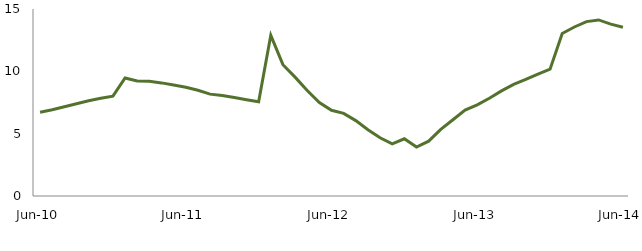
| Category | Series 0 |
|---|---|
| Jun-10 | 6.716 |
|  | 6.916 |
|  | 7.153 |
|  | 7.4 |
|  | 7.635 |
|  | 7.833 |
|  | 8.011 |
|  | 9.465 |
|  | 9.221 |
|  | 9.199 |
|  | 9.073 |
|  | 8.902 |
| Jun-11 | 8.725 |
|  | 8.478 |
|  | 8.171 |
|  | 8.061 |
|  | 7.897 |
|  | 7.718 |
|  | 7.555 |
|  | 12.888 |
|  | 10.533 |
|  | 9.535 |
|  | 8.464 |
|  | 7.503 |
| Jun-12 | 6.876 |
|  | 6.627 |
|  | 6.048 |
|  | 5.317 |
|  | 4.667 |
|  | 4.185 |
|  | 4.593 |
|  | 3.923 |
|  | 4.399 |
|  | 5.348 |
|  | 6.118 |
|  | 6.892 |
| Jun-13 | 7.316 |
|  | 7.838 |
|  | 8.434 |
|  | 8.951 |
|  | 9.352 |
|  | 9.785 |
|  | 10.174 |
|  | 13.032 |
|  | 13.557 |
|  | 13.989 |
|  | 14.123 |
|  | 13.79 |
| Jun-14 | 13.541 |